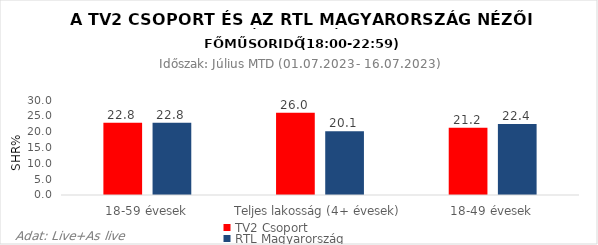
| Category | TV2 Csoport | RTL Magyarország |
|---|---|---|
| 18-59 évesek | 22.8 | 22.8 |
| Teljes lakosság (4+ évesek) | 26 | 20.1 |
| 18-49 évesek | 21.2 | 22.4 |